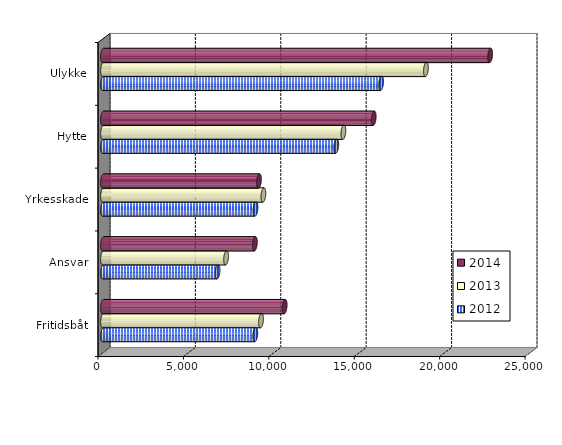
| Category | 2012 | 2013 | 2014 |
|---|---|---|---|
| Fritidsbåt | 8915 | 9251 | 10634 |
| Ansvar | 6707 | 7206 | 8890 |
| Yrkesskade | 8926 | 9389 | 9130 |
| Hytte | 13654 | 14071 | 15847 |
| Ulykke | 16278 | 18904 | 22664 |